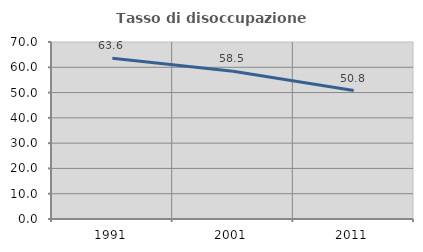
| Category | Tasso di disoccupazione giovanile  |
|---|---|
| 1991.0 | 63.566 |
| 2001.0 | 58.462 |
| 2011.0 | 50.794 |